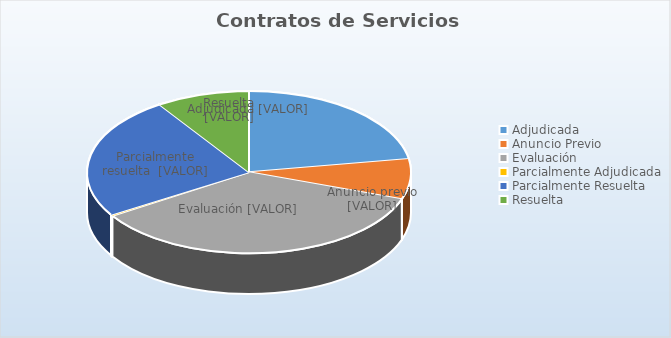
| Category | Servicios |
|---|---|
| Adjudicada | 3217575.69 |
| Anuncio Previo | 1145176.07 |
| Evaluación | 5104095.05 |
| Parcialmente Adjudicada | 36106.87 |
| Parcialmente Resuelta | 3511914.91 |
| Resuelta | 1337749.49 |